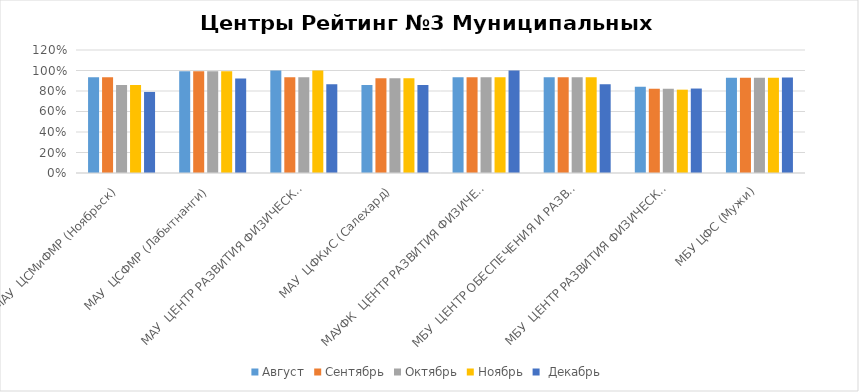
| Category | Август | Сентябрь | Октябрь | Ноябрь |  Декабрь |
|---|---|---|---|---|---|
| МАУ  ЦСМиФМР (Ноябрьск) | 0.933 | 0.933 | 0.858 | 0.858 | 0.791 |
| МАУ  ЦСФМР (Лабытнанги) | 0.992 | 0.992 | 0.992 | 0.992 | 0.922 |
| МАУ  ЦЕНТР РАЗВИТИЯ ФИЗИЧЕСКОЙ КУЛЬТУРЫ И СПОРТА (Новый Уренгой) | 1 | 0.933 | 0.933 | 1 | 0.866 |
| МАУ  ЦФКиС (Салехард) | 0.858 | 0.924 | 0.924 | 0.924 | 0.858 |
| МАУФК  ЦЕНТР РАЗВИТИЯ ФИЗИЧЕСКОЙ КУЛЬТУРЫ И СПОРТА (Надым) | 0.933 | 0.933 | 0.933 | 0.933 | 1 |
| МБУ  ЦЕНТР ОБЕСПЕЧЕНИЯ И РАЗВИТИЯ ФИЗИЧЕСКОЙ КУЛЬТУРЫ И СПОРТА КРАСНОСЕЛЬКУПСКОГО РАЙОНА (Красноселькуп) | 0.933 | 0.933 | 0.933 | 0.933 | 0.866 |
| МБУ  ЦЕНТР РАЗВИТИЯ ФИЗИЧЕСКОЙ КУЛЬТУРЫ И СПОРТА (Тазовский) | 0.842 | 0.822 | 0.822 | 0.813 | 0.824 |
| МБУ ЦФС (Мужи) | 0.93 | 0.93 | 0.93 | 0.93 | 0.931 |